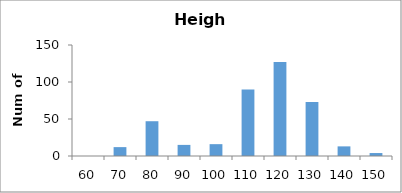
| Category | Series 0 |
|---|---|
| 60.0 | 0 |
| 70.0 | 12 |
| 80.0 | 47 |
| 90.0 | 15 |
| 100.0 | 16 |
| 110.0 | 90 |
| 120.0 | 127 |
| 130.0 | 73 |
| 140.0 | 13 |
| 150.0 | 4 |